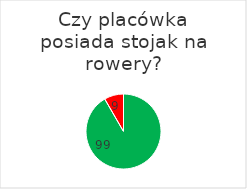
| Category | Series 0 |
|---|---|
| 0 | 99 |
| 1 | 9 |